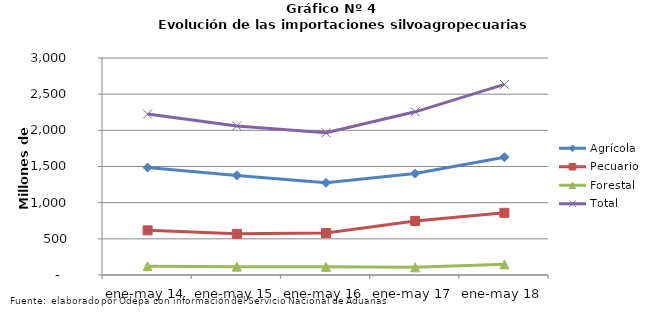
| Category | Agrícola | Pecuario | Forestal | Total |
|---|---|---|---|---|
| ene-may 14 | 1485826 | 616985 | 121584 | 2224395 |
| ene-may 15 | 1376871 | 569008 | 115533 | 2061412 |
| ene-may 16 | 1274150 | 579328 | 112607 | 1966085 |
| ene-may 17 | 1402574 | 746993 | 106491 | 2256058 |
| ene-may 18 | 1629071 | 859151 | 147227 | 2635449 |